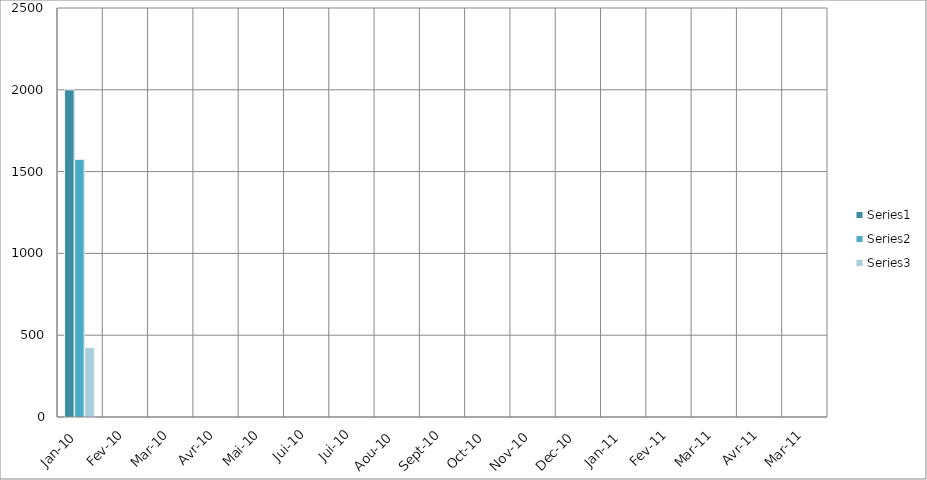
| Category | Series 0 | Series 1 | Series 2 |
|---|---|---|---|
| Jan-10 | 2000 | 1575 | 425 |
| Fev-10 | 0 | 0 | 0 |
| Mar-10 | 0 | 0 | 0 |
| Avr-10 | 0 | 0 | 0 |
| Mai-10 | 0 | 0 | 0 |
| Jui-10 | 0 | 0 | 0 |
| Jui-10 | 0 | 0 | 0 |
| Aou-10 | 0 | 0 | 0 |
| Sep-10 | 0 | 0 | 0 |
| Oct-10 | 0 | 0 | 0 |
| Nov-10 | 0 | 0 | 0 |
| Dec-10 | 0 | 0 | 0 |
| Jan-11 | 0 | 0 | 0 |
| Fev-11 | 0 | 0 | 0 |
| Mar-11 | 0 | 0 | 0 |
| Avr-11 | 0 | 0 | 0 |
| Mar-11 | 0 | 0 | 0 |